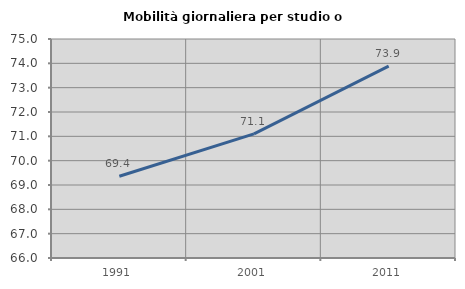
| Category | Mobilità giornaliera per studio o lavoro |
|---|---|
| 1991.0 | 69.358 |
| 2001.0 | 71.098 |
| 2011.0 | 73.884 |